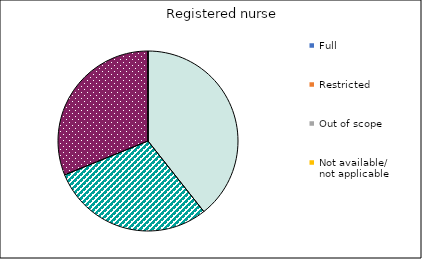
| Category | Registered nurse | Nurse practitioner |
|---|---|---|
| Full | 24 | 0 |
| Restricted | 18 | 0 |
| Out of scope | 19 | 0 |
| Not available/
not applicable | 0 | 0 |